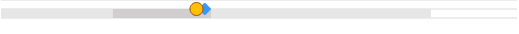
| Category | left | mid start | mid end | right |
|---|---|---|---|---|
| 0 | 0 | 0.26 | 0.229 | 0.512 |